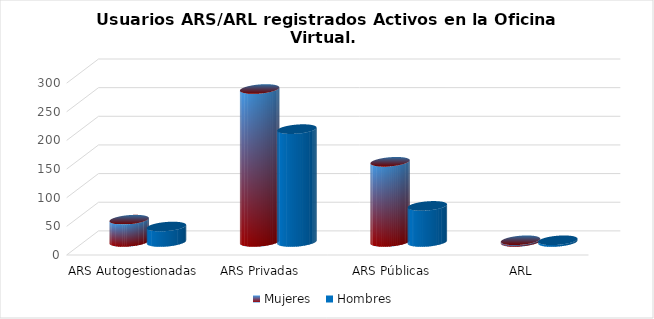
| Category | Mujeres | Hombres |
|---|---|---|
| ARS Autogestionadas | 39 | 27 |
| ARS Privadas | 267 | 197 |
| ARS Públicas | 140 | 63 |
| ARL | 3 | 3 |